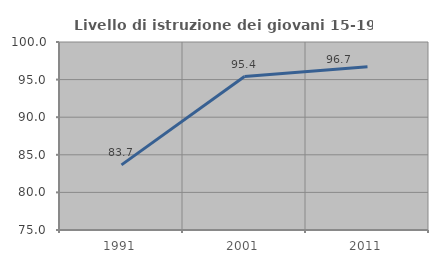
| Category | Livello di istruzione dei giovani 15-19 anni |
|---|---|
| 1991.0 | 83.658 |
| 2001.0 | 95.406 |
| 2011.0 | 96.705 |